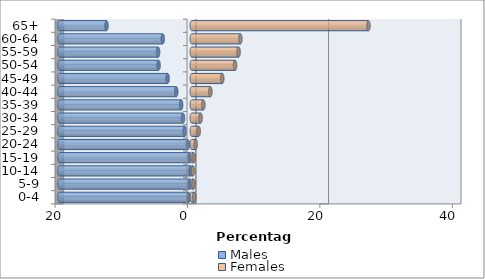
| Category | Males | Females |
|---|---|---|
| 0-4 | -0.447 | 0.371 |
| 5-9 | -0.288 | 0.255 |
| 10-14 | -0.193 | 0.181 |
| 15-19 | -0.286 | 0.277 |
| 20-24 | -0.601 | 0.585 |
| 25-29 | -1.069 | 1.044 |
| 30-34 | -1.33 | 1.328 |
| 35-39 | -1.6 | 1.749 |
| 40-44 | -2.345 | 2.808 |
| 45-49 | -3.651 | 4.605 |
| 50-54 | -5.013 | 6.538 |
| 55-59 | -5.083 | 7.067 |
| 60-64 | -4.385 | 7.341 |
| 65+ | -12.88 | 26.682 |